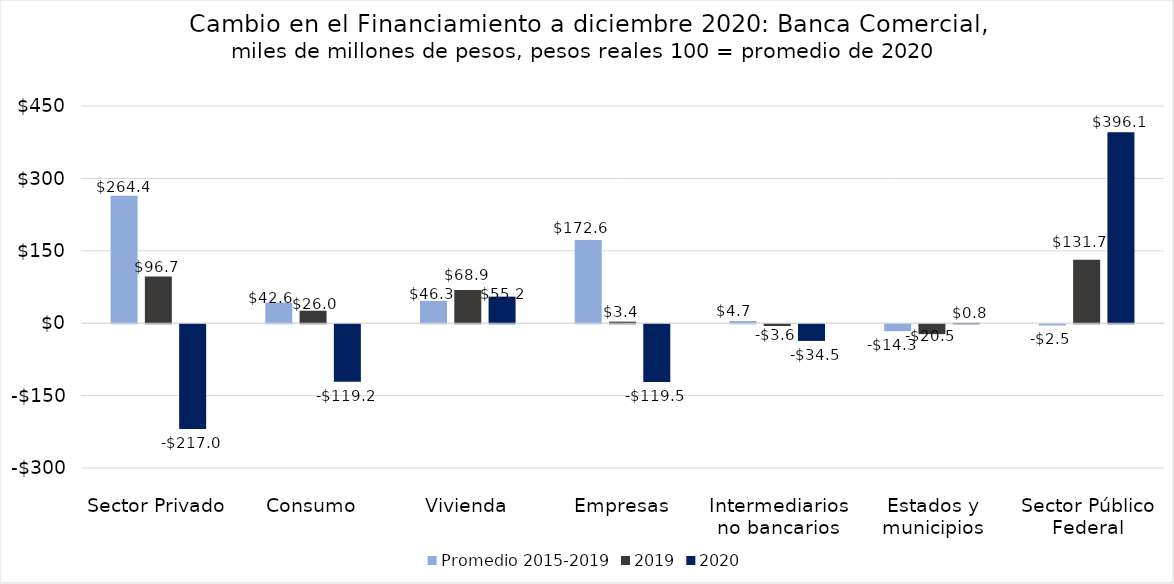
| Category | Promedio 2015-2019 | 2019 | 2020 |
|---|---|---|---|
| Sector Privado | 264.356 | 96.726 | -216.953 |
| Consumo | 42.644 | 25.975 | -119.173 |
| Vivienda | 46.305 | 68.894 | 55.157 |
| Empresas | 172.619 | 3.368 | -119.479 |
| Intermediarios no bancarios | 4.709 | -3.582 | -34.518 |
| Estados y municipios | -14.251 | -20.455 | 0.768 |
| Sector Público Federal | -2.526 | 131.669 | 396.097 |